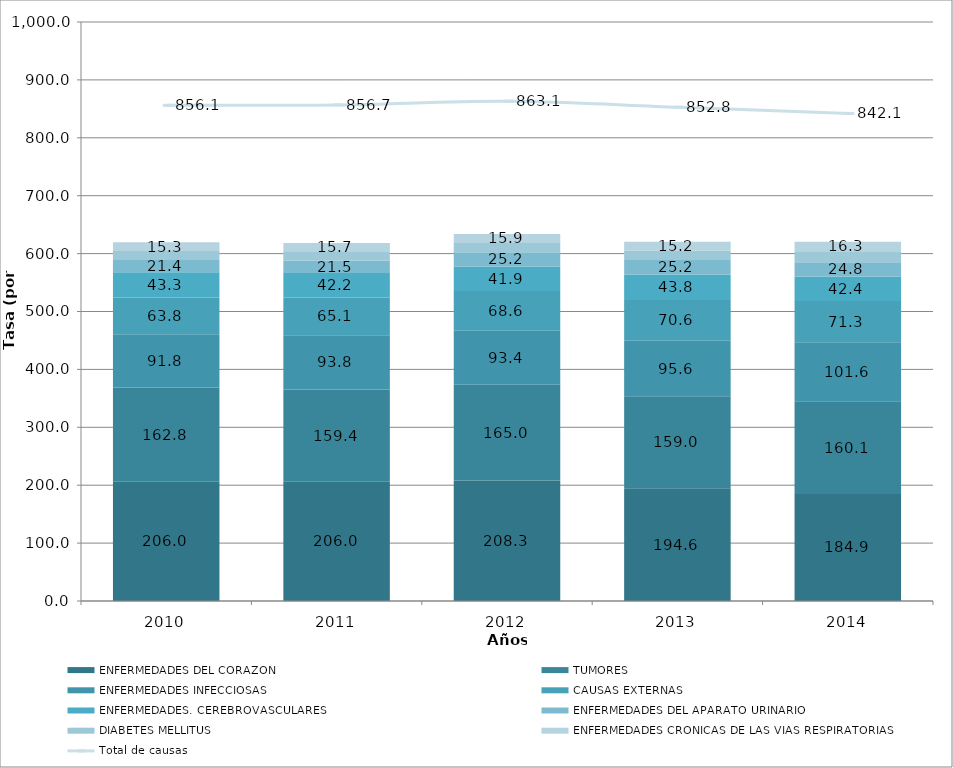
| Category | ENFERMEDADES DEL CORAZON | TUMORES | ENFERMEDADES INFECCIOSAS | CAUSAS EXTERNAS | ENFERMEDADES. CEREBROVASCULARES | ENFERMEDADES DEL APARATO URINARIO | DIABETES MELLITUS | ENFERMEDADES CRONICAS DE LAS VIAS RESPIRATORIAS |
|---|---|---|---|---|---|---|---|---|
| 2010.0 | 205.962 | 162.751 | 91.84 | 63.762 | 43.315 | 21.384 | 15.498 | 15.276 |
| 2011.0 | 205.966 | 159.403 | 93.795 | 65.119 | 42.178 | 21.462 | 14.814 | 15.688 |
| 2012.0 | 208.276 | 165.005 | 93.387 | 68.621 | 41.937 | 25.249 | 15.698 | 15.85 |
| 2013.0 | 194.646 | 159.049 | 95.585 | 70.553 | 43.79 | 25.207 | 16.562 | 15.245 |
| 2014.0 | 184.901 | 160.139 | 101.639 | 71.334 | 42.357 | 24.787 | 19.021 | 16.318 |